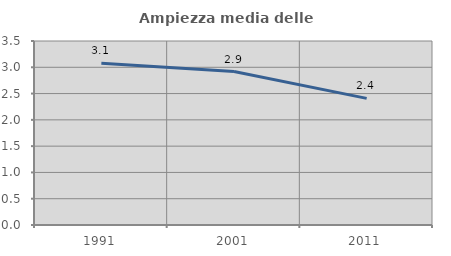
| Category | Ampiezza media delle famiglie |
|---|---|
| 1991.0 | 3.077 |
| 2001.0 | 2.918 |
| 2011.0 | 2.409 |